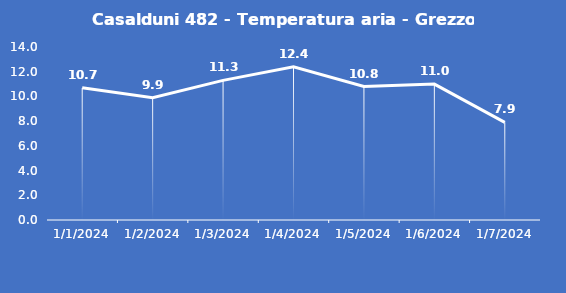
| Category | Casalduni 482 - Temperatura aria - Grezzo (°C) |
|---|---|
| 1/1/24 | 10.7 |
| 1/2/24 | 9.9 |
| 1/3/24 | 11.3 |
| 1/4/24 | 12.4 |
| 1/5/24 | 10.8 |
| 1/6/24 | 11 |
| 1/7/24 | 7.9 |